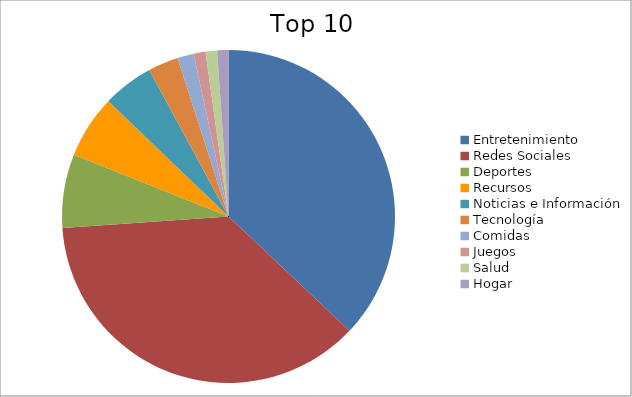
| Category | Series 0 |
|---|---|
| Entretenimiento | 35.38 |
| Redes Sociales | 35.18 |
| Deportes | 6.83 |
| Recursos | 5.85 |
| Noticias e Información | 4.71 |
| Tecnología | 2.81 |
| Comidas | 1.52 |
| Juegos | 1.1 |
| Salud | 1.07 |
| Hogar | 1.04 |